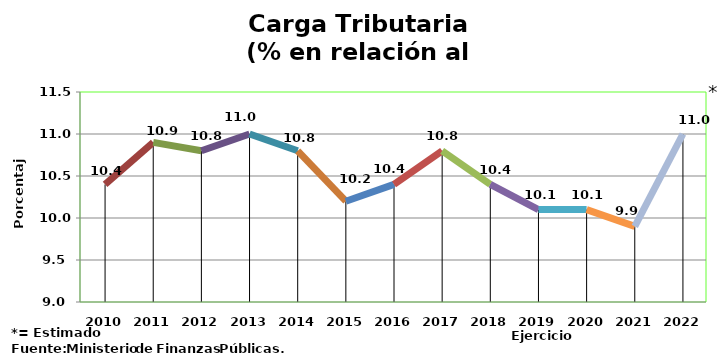
| Category | Series 0 |
|---|---|
| 2010 | 10.4 |
| 2011 | 10.9 |
| 2012 | 10.8 |
| 2013 | 11 |
| 2014 | 10.8 |
| 2015 | 10.2 |
| 2016 | 10.4 |
| 2017 | 10.8 |
| 2018 | 10.4 |
| 2019 | 10.1 |
| 2020 | 10.1 |
| 2021 | 9.9 |
| 2022 | 11 |